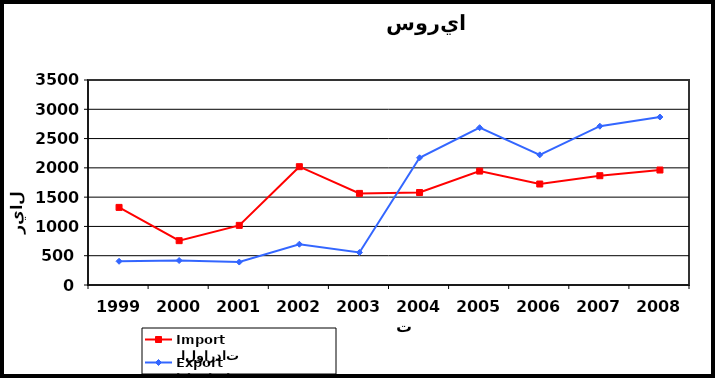
| Category |  الواردات           Import | الصادرات          Export |
|---|---|---|
| 1999.0 | 1325 | 405 |
| 2000.0 | 757 | 418 |
| 2001.0 | 1018 | 392 |
| 2002.0 | 2020 | 696 |
| 2003.0 | 1564 | 555 |
| 2004.0 | 1579 | 2172 |
| 2005.0 | 1945 | 2686 |
| 2006.0 | 1724 | 2222 |
| 2007.0 | 1866 | 2711 |
| 2008.0 | 1963 | 2868 |